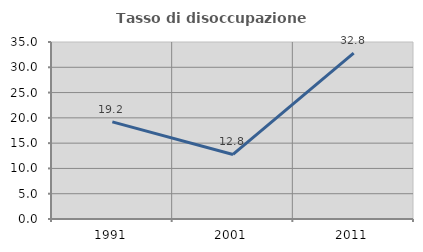
| Category | Tasso di disoccupazione giovanile  |
|---|---|
| 1991.0 | 19.2 |
| 2001.0 | 12.766 |
| 2011.0 | 32.787 |